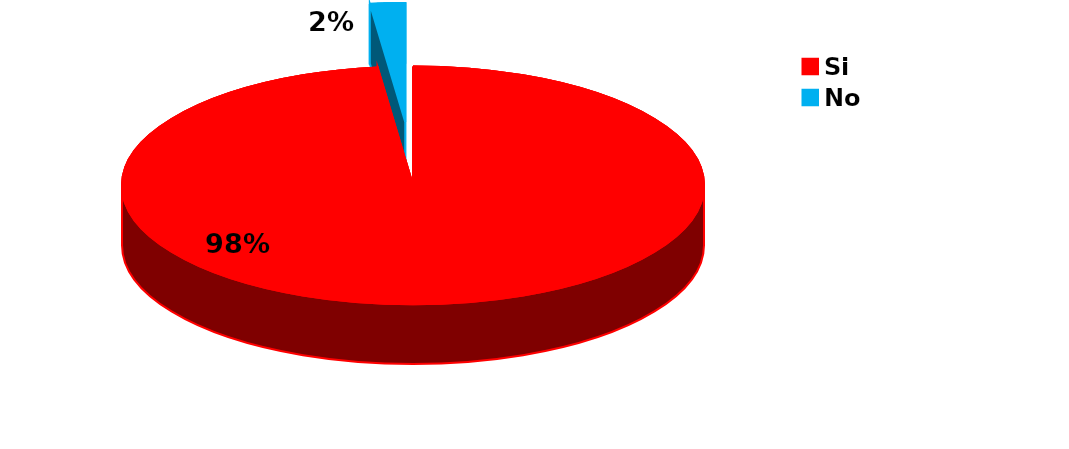
| Category | Series 0 |
|---|---|
| Si | 101 |
| No | 2 |